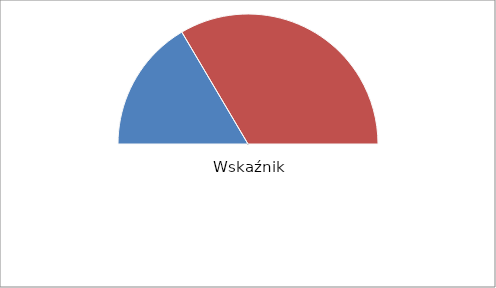
| Category | Series 0 |
|---|---|
| Zakreskowane | 0.165 |
| Niezakresowane | 0.335 |
| Pozostale | 0.5 |